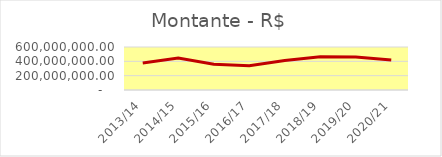
| Category | Montante |
|---|---|
| 2013/14 | 377224641.7 |
| 2014/15 | 446689565.22 |
| 2015/16 | 357984386.53 |
| 2016/17 | 338946347.87 |
| 2017/18 | 412275995.42 |
| 2018/19 | 464556779.33 |
| 2019/20 | 458893651.89 |
| 2020/21 | 419594800.42 |